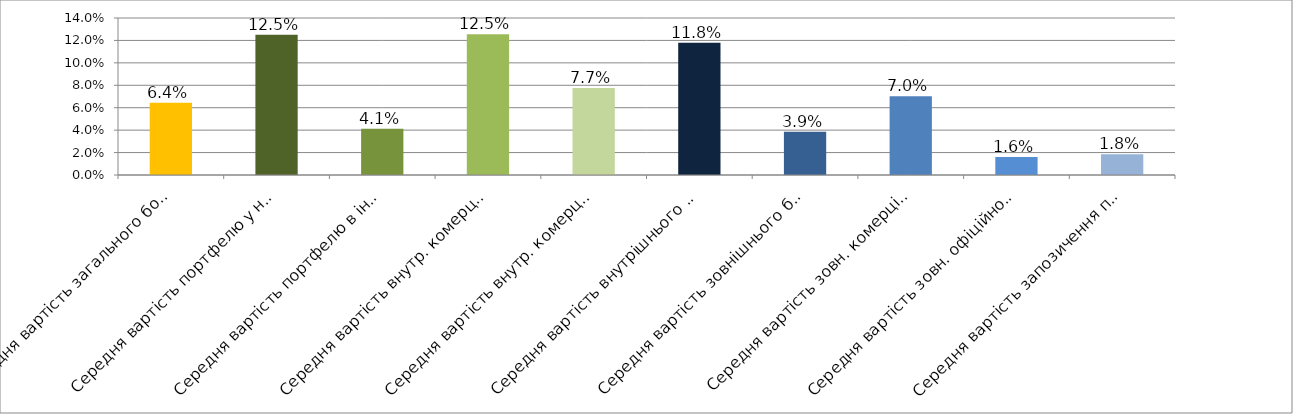
| Category | Series 0 |
|---|---|
| Середня вартість загального боргового портфелю | 0.064 |
| Середня вартість портфелю у нац.валюті | 0.125 |
| Середня вартість портфелю в іноземній валюті | 0.041 |
| Середня вартість внутр. комерційного портфелю в нац.валюті | 0.125 |
| Середня вартість внутр. комерційного портфелю в іноземній валюті | 0.077 |
| Середня вартість внутрішнього боргового портфелю | 0.118 |
| Середня вартість зовнішнього боргового портфелю | 0.039 |
| Середня вартість зовн. комерційного портфелю в іноземній валюті | 0.07 |
| Середня вартість зовн. офіційного портфелю в іноземній валюті | 0.016 |
| Середня вартість запозичення під держгарантії США в іноземній валюті | 0.018 |